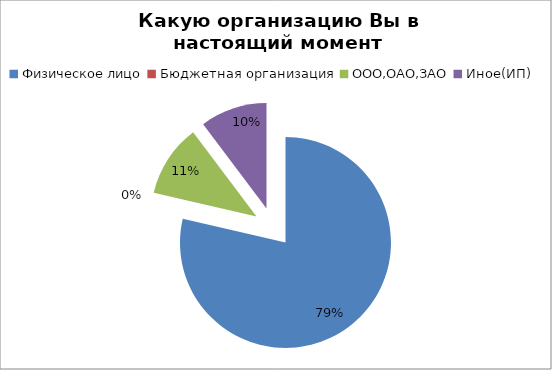
| Category | Какую организацию Вы в настоящий момент представляете? |
|---|---|
| Физическое лицо | 92 |
| Бюджетная организация | 0 |
| ООО,ОАО,ЗАО | 13 |
| Иное(ИП) | 12 |